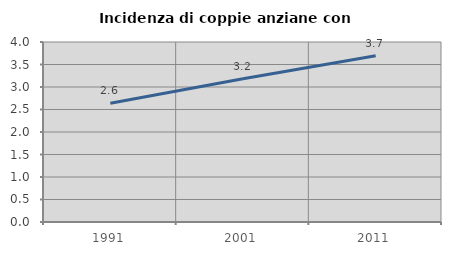
| Category | Incidenza di coppie anziane con figli |
|---|---|
| 1991.0 | 2.639 |
| 2001.0 | 3.181 |
| 2011.0 | 3.694 |